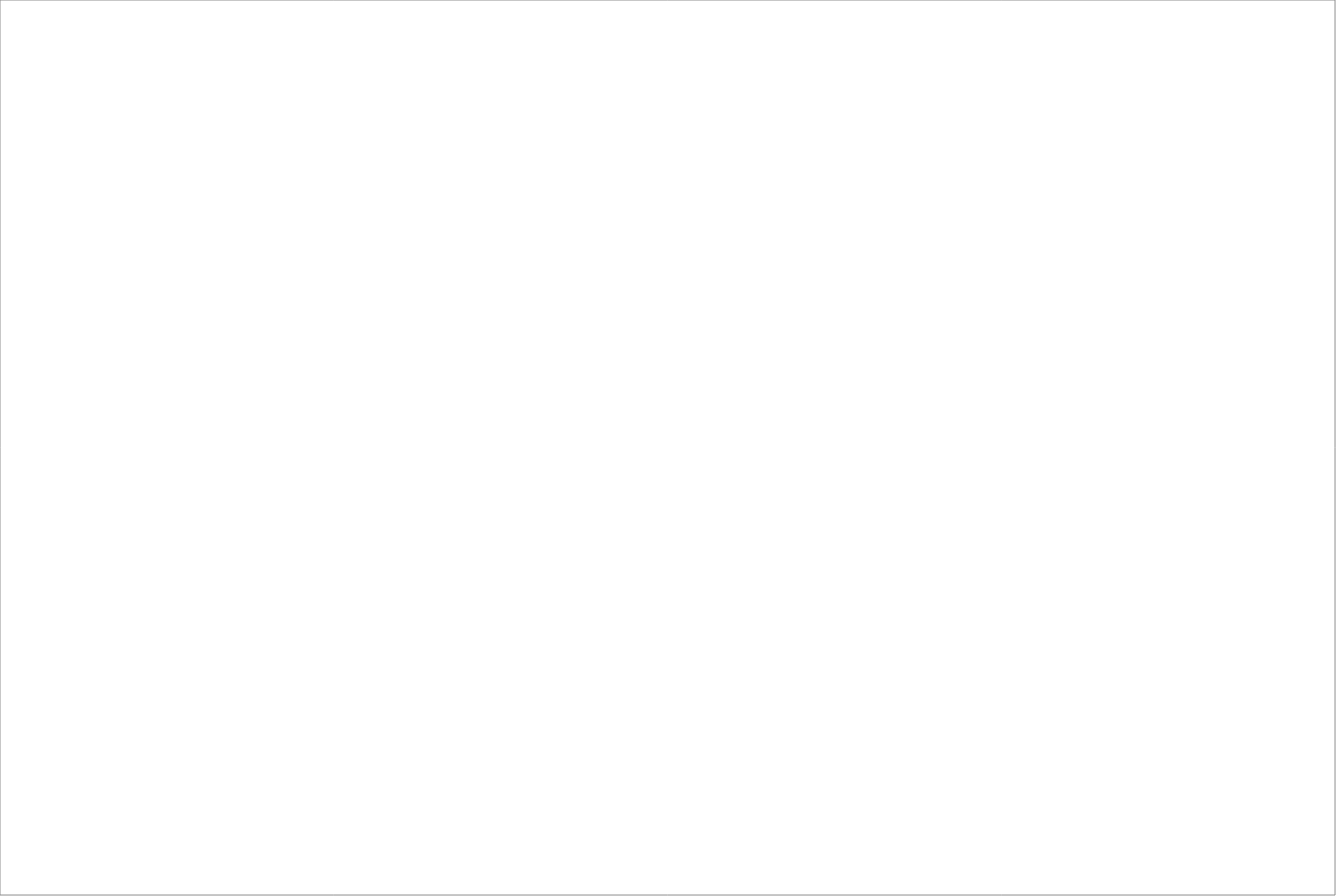
| Category | Total |
|---|---|
| Clockwork Bemanning & Rekrytering AB | 87.5 |
| Randstad AB | 70.5 |
| Poolia Sverige Aktiebolag | 65 |
| StudentConsulting Sweden AB | 65 |
| Academic Work Sweden AB | 62.5 |